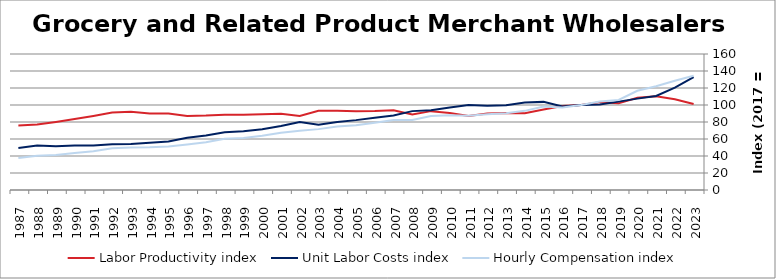
| Category | Labor Productivity index | Unit Labor Costs index | Hourly Compensation index |
|---|---|---|---|
| 2023.0 | 101.232 | 132.776 | 134.413 |
| 2022.0 | 106.829 | 120.34 | 128.558 |
| 2021.0 | 110.36 | 110.619 | 122.079 |
| 2020.0 | 108.546 | 107.499 | 116.686 |
| 2019.0 | 101.945 | 103.978 | 106 |
| 2018.0 | 103.376 | 100.696 | 104.096 |
| 2017.0 | 100 | 100 | 100 |
| 2016.0 | 98.918 | 98.187 | 97.125 |
| 2015.0 | 94.773 | 103.674 | 98.255 |
| 2014.0 | 90.427 | 102.976 | 93.118 |
| 2013.0 | 90.629 | 99.788 | 90.437 |
| 2012.0 | 89.917 | 99.157 | 89.159 |
| 2011.0 | 87.126 | 100.136 | 87.244 |
| 2010.0 | 90.697 | 97.117 | 88.082 |
| 2009.0 | 92.781 | 93.83 | 87.057 |
| 2008.0 | 88.821 | 92.796 | 82.422 |
| 2007.0 | 93.833 | 87.727 | 82.317 |
| 2006.0 | 92.996 | 85.077 | 79.118 |
| 2005.0 | 92.71 | 82.202 | 76.209 |
| 2004.0 | 93.112 | 80.093 | 74.576 |
| 2003.0 | 93.115 | 76.917 | 71.621 |
| 2002.0 | 87.046 | 80.086 | 69.711 |
| 2001.0 | 89.59 | 75.236 | 67.404 |
| 2000.0 | 89.203 | 71.434 | 63.721 |
| 1999.0 | 88.469 | 69.226 | 61.244 |
| 1998.0 | 88.472 | 68.043 | 60.198 |
| 1997.0 | 87.519 | 64.047 | 56.053 |
| 1996.0 | 87.189 | 61.467 | 53.592 |
| 1995.0 | 90.001 | 57.012 | 51.312 |
| 1994.0 | 90.127 | 55.69 | 50.192 |
| 1993.0 | 92.141 | 54.16 | 49.904 |
| 1992.0 | 91.065 | 53.898 | 49.082 |
| 1991.0 | 87.019 | 52.431 | 45.625 |
| 1990.0 | 83.475 | 52.277 | 43.638 |
| 1989.0 | 80.129 | 51.415 | 41.198 |
| 1988.0 | 77.005 | 52.233 | 40.222 |
| 1987.0 | 76.016 | 49.344 | 37.51 |